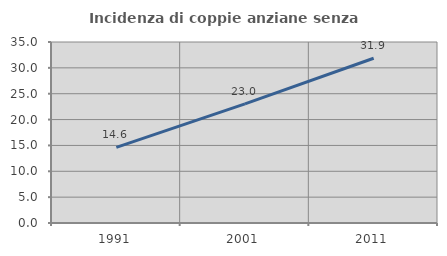
| Category | Incidenza di coppie anziane senza figli  |
|---|---|
| 1991.0 | 14.634 |
| 2001.0 | 23.045 |
| 2011.0 | 31.863 |